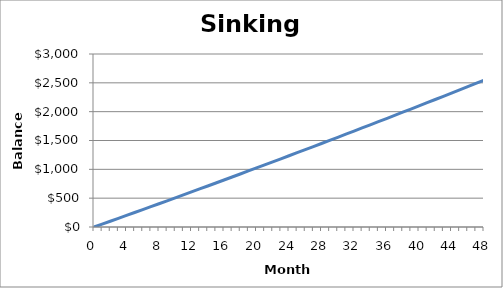
| Category | Series 0 |
|---|---|
| 0.0 | 0 |
| 1.0 | 50 |
| 2.0 | 100.13 |
| 3.0 | 150.38 |
| 4.0 | 200.76 |
| 5.0 | 251.26 |
| 6.0 | 301.89 |
| 7.0 | 352.64 |
| 8.0 | 403.52 |
| 9.0 | 454.53 |
| 10.0 | 505.67 |
| 11.0 | 556.93 |
| 12.0 | 608.32 |
| 13.0 | 659.84 |
| 14.0 | 711.49 |
| 15.0 | 763.27 |
| 16.0 | 815.18 |
| 17.0 | 867.22 |
| 18.0 | 919.39 |
| 19.0 | 971.69 |
| 20.0 | 1024.12 |
| 21.0 | 1076.68 |
| 22.0 | 1129.37 |
| 23.0 | 1182.19 |
| 24.0 | 1235.15 |
| 25.0 | 1288.24 |
| 26.0 | 1341.46 |
| 27.0 | 1394.81 |
| 28.0 | 1448.3 |
| 29.0 | 1501.92 |
| 30.0 | 1555.67 |
| 31.0 | 1609.56 |
| 32.0 | 1663.58 |
| 33.0 | 1717.74 |
| 34.0 | 1772.03 |
| 35.0 | 1826.46 |
| 36.0 | 1881.03 |
| 37.0 | 1935.73 |
| 38.0 | 1990.57 |
| 39.0 | 2045.55 |
| 40.0 | 2100.66 |
| 41.0 | 2155.91 |
| 42.0 | 2211.3 |
| 43.0 | 2266.83 |
| 44.0 | 2322.5 |
| 45.0 | 2378.31 |
| 46.0 | 2434.26 |
| 47.0 | 2490.35 |
| 48.0 | 2546.58 |